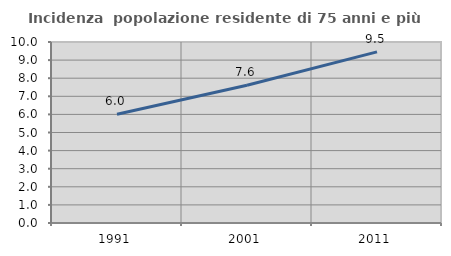
| Category | Incidenza  popolazione residente di 75 anni e più |
|---|---|
| 1991.0 | 6.008 |
| 2001.0 | 7.607 |
| 2011.0 | 9.454 |